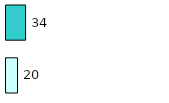
| Category | Series 0 | Series 1 |
|---|---|---|
| 0 | 20 | 34 |